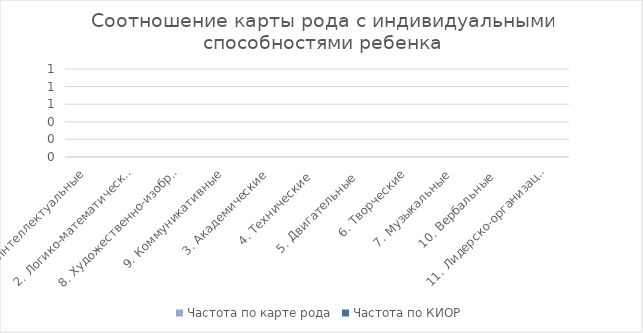
| Category | Частота по карте рода | Частота по КИОР |
|---|---|---|
| 1. Интеллектуальные | 0 | 0 |
| 2. Логико-математические | 0 | 0 |
| 8. Художественно-изобразительные | 0 | 0 |
| 9. Коммуникативные | 0 | 0 |
| 3. Академические | 0 | 0 |
| 4. Технические  | 0 | 0 |
| 5. Двигательные  | 0 | 0 |
| 6. Творческие | 0 | 0 |
| 7. Музыкальные | 0 | 0 |
| 10. Вербальные  | 0 | 0 |
| 11. Лидерско-организационные | 0 | 0 |